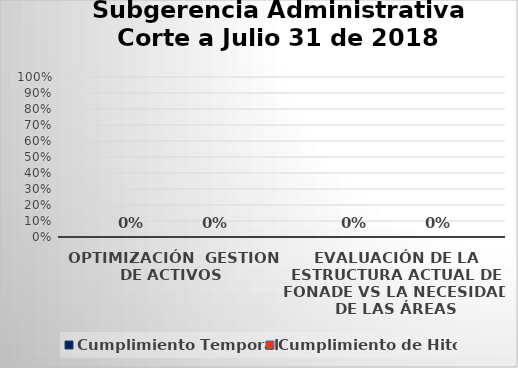
| Category | Cumplimiento Temporal | Cumplimiento de Hitos |
|---|---|---|
| OPTIMIZACIÓN  GESTION DE ACTIVOS | 0 | 0 |
| EVALUACIÓN DE LA ESTRUCTURA ACTUAL DE FONADE VS LA NECESIDAD DE LAS ÁREAS | 0 | 0 |